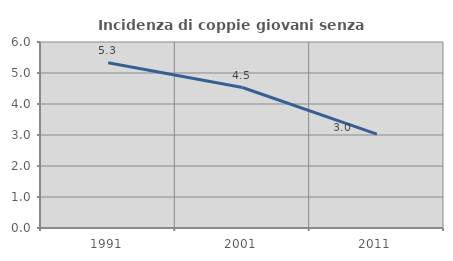
| Category | Incidenza di coppie giovani senza figli |
|---|---|
| 1991.0 | 5.331 |
| 2001.0 | 4.531 |
| 2011.0 | 3.03 |